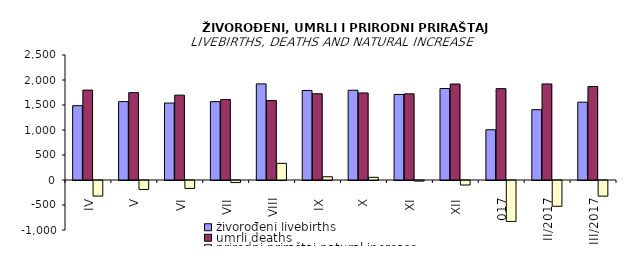
| Category | živorođeni livebirths | umrli deaths | prirodni priraštaj natural increase |
|---|---|---|---|
| IV | 1486 | 1798 | -312 |
| V | 1568 | 1747 | -179 |
| VI | 1539 | 1697 | -158 |
| VII | 1567 | 1608 | -41 |
| VIII | 1922 | 1589 | 333 |
| IX | 1790 | 1725 | 65 |
| X | 1795 | 1741 | 54 |
| XI | 1711 | 1723 | -12 |
| XII | 1830 | 1920 | -90 |
| I/2017 | 1005 | 1827 | -822 |
| II/2017 | 1406 | 1921 | -515 |
| III/2017 | 1556 | 1869 | -313 |